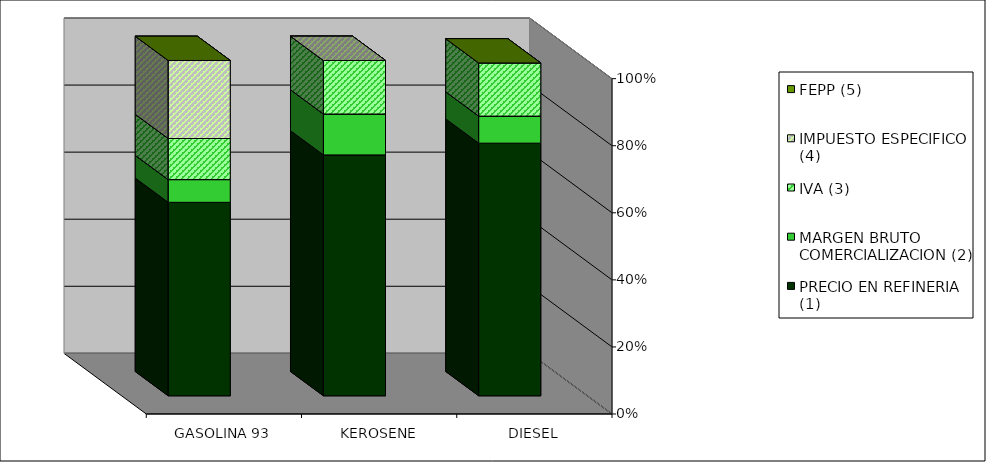
| Category | PRECIO EN REFINERIA (1) | MARGEN BRUTO COMERCIALIZACION (2) | IVA (3) | IMPUESTO ESPECIFICO (4) | FEPP (5) |
|---|---|---|---|---|---|
| GASOLINA 93 | 0.577 | 0.068 | 0.123 | 0.233 | 0 |
| KEROSENE | 0.718 | 0.122 | 0.16 | 0 | 0 |
| DIESEL | 0.765 | 0.082 | 0.161 | -0.008 | 0 |